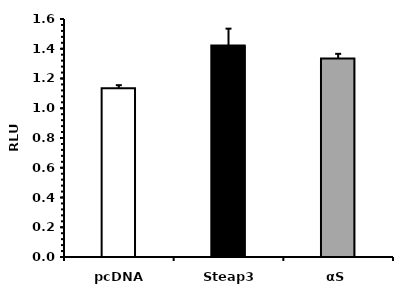
| Category | Series 0 |
|---|---|
| pcDNA | 1.135 |
| Steap3 | 1.421 |
| αS | 1.334 |